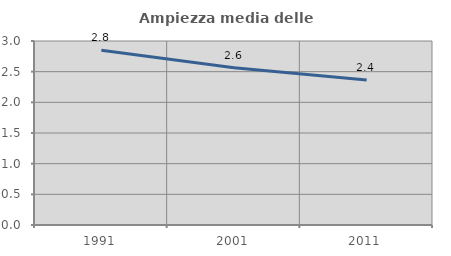
| Category | Ampiezza media delle famiglie |
|---|---|
| 1991.0 | 2.849 |
| 2001.0 | 2.563 |
| 2011.0 | 2.365 |